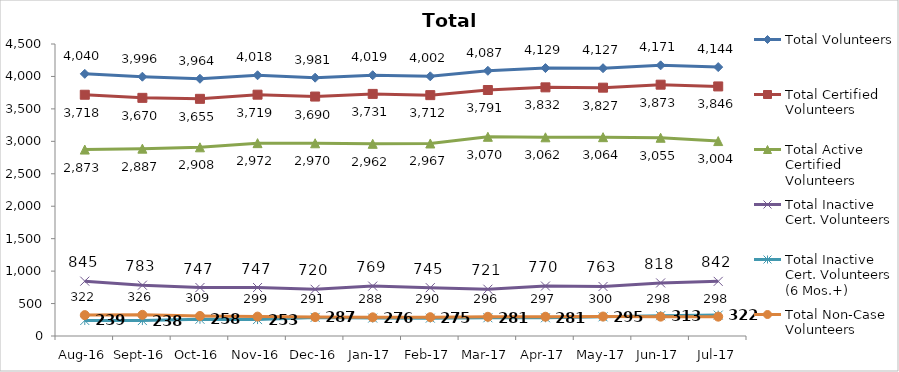
| Category | Total Volunteers | Total Certified Volunteers | Total Active Certified Volunteers | Total Inactive Cert. Volunteers | Total Inactive Cert. Volunteers (6 Mos.+) | Total Non-Case Volunteers |
|---|---|---|---|---|---|---|
| Aug-16 | 4040 | 3718 | 2873 | 845 | 239 | 322 |
| Sep-16 | 3996 | 3670 | 2887 | 783 | 238 | 326 |
| Oct-16 | 3964 | 3655 | 2908 | 747 | 258 | 309 |
| Nov-16 | 4018 | 3719 | 2972 | 747 | 253 | 299 |
| Dec-16 | 3981 | 3690 | 2970 | 720 | 287 | 291 |
| Jan-17 | 4019 | 3731 | 2962 | 769 | 276 | 288 |
| Feb-17 | 4002 | 3712 | 2967 | 745 | 275 | 290 |
| Mar-17 | 4087 | 3791 | 3070 | 721 | 281 | 296 |
| Apr-17 | 4129 | 3832 | 3062 | 770 | 281 | 297 |
| May-17 | 4127 | 3827 | 3064 | 763 | 295 | 300 |
| Jun-17 | 4171 | 3873 | 3055 | 818 | 313 | 298 |
| Jul-17 | 4144 | 3846 | 3004 | 842 | 322 | 298 |